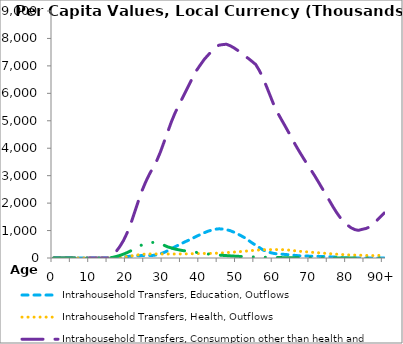
| Category | Intrahousehold Transfers, Education, Outflows | Intrahousehold Transfers, Health, Outflows | Intrahousehold Transfers, Consumption other than health and education, Outflows | Intrahousehold Transfers, Saving, Outflows |
|---|---|---|---|---|
| 0 | 0 | 0 | 0 | 0 |
|  | 0 | 0 | 0 | 0 |
| 2 | 0 | 0 | 0 | 0 |
| 3 | 0 | 0 | 0 | 0 |
| 4 | 0 | 0 | 0 | 0 |
| 5 | 0 | 0 | 0 | 0 |
| 6 | 0 | 0 | 0 | 0 |
| 7 | 0 | 0 | 0 | 0 |
| 8 | 0 | 0 | 0 | 0 |
| 9 | 0 | 0 | 0 | 0 |
| 10 | 0 | 0 | 0 | 0 |
| 11 | 0 | 0 | 0 | 0 |
| 12 | 0 | 0 | 0 | 0 |
| 13 | 0 | 0 | 0 | 0 |
| 14 | 0 | 0 | 0 | 0 |
| 15 | 0 | 0 | 0 | 0 |
| 16 | 5751.779 | 3664.066 | 90783.375 | 22362.815 |
| 17 | 15721.843 | 10719.154 | 239478.714 | 54122.408 |
| 18 | 26796.242 | 19887.261 | 422485.626 | 93887.802 |
| 19 | 39898.469 | 31972.367 | 641475.922 | 141720.232 |
| 20 | 53307.713 | 50377.201 | 922863.543 | 198467.022 |
| 21 | 65915.686 | 71676.03 | 1264449.566 | 264018.356 |
| 22 | 76387.824 | 93282.776 | 1659430.143 | 345818.272 |
| 23 | 84462.599 | 114899.242 | 2066322.743 | 416702.438 |
| 24 | 87700.63 | 132815.177 | 2444062.663 | 476930.473 |
| 25 | 88024.012 | 141977.637 | 2763566.712 | 530974.066 |
| 26 | 90559.66 | 147010.165 | 3043317.891 | 567833.611 |
| 27 | 95369.835 | 149658.138 | 3287810.862 | 566026.323 |
| 28 | 113474.07 | 148495.606 | 3532414.113 | 549698.798 |
| 29 | 148889.954 | 146686.148 | 3848365.635 | 512453.689 |
| 30 | 200869.479 | 146550.044 | 4215943.782 | 465788.579 |
| 31 | 260337.31 | 146612.835 | 4583135.683 | 406545.454 |
| 32 | 334968.296 | 145510.018 | 4952834.11 | 367556.664 |
| 33 | 406999.747 | 145555.724 | 5277595.894 | 325736.119 |
| 34 | 473016.343 | 146498.411 | 5554986.558 | 299927.958 |
| 35 | 539384.999 | 147591.944 | 5822922.779 | 272353.391 |
| 36 | 605287.455 | 150588.378 | 6088617.946 | 257730.01 |
| 37 | 664993.953 | 154583.567 | 6356081.541 | 237605.845 |
| 38 | 731362.327 | 157622.49 | 6623345.521 | 222773.902 |
| 39 | 798024.316 | 161089.445 | 6858486.676 | 201534.596 |
| 40 | 861143.091 | 164423.369 | 7053281.228 | 183188.299 |
| 41 | 920767.536 | 165113.954 | 7239840.499 | 162992.704 |
| 42 | 975821.577 | 166334.302 | 7390362.517 | 144718.904 |
| 43 | 1015018.739 | 169277.599 | 7532075.256 | 130539.081 |
| 44 | 1048737.216 | 173063.272 | 7666680.624 | 117564.872 |
| 45 | 1063179.166 | 178604.994 | 7755136.698 | 106725.239 |
| 46 | 1056072.821 | 186771.914 | 7775368.742 | 96605.611 |
| 47 | 1031865.321 | 196193.249 | 7789660.388 | 87659.472 |
| 48 | 997925.363 | 205409.053 | 7737203.747 | 78094.617 |
| 49 | 943963.88 | 215126.214 | 7663082.941 | 69991.327 |
| 50 | 883830.512 | 224590.789 | 7573681.321 | 62272.442 |
| 51 | 811569.383 | 235408.7 | 7486431.798 | 55525.03 |
| 52 | 738479.462 | 246623.579 | 7365901.763 | 49785.27 |
| 53 | 645204.372 | 259893.362 | 7270596.159 | 45287.57 |
| 54 | 551209.739 | 273281.731 | 7162617.933 | 41535.888 |
| 55 | 463890.204 | 284303.85 | 7051922.899 | 36467.216 |
| 56 | 379719.361 | 294253.285 | 6830602.187 | 31912.763 |
| 57 | 292609.494 | 301077.48 | 6556585.396 | 28533.702 |
| 58 | 237167.729 | 303883.383 | 6230500.233 | 25923.006 |
| 59 | 196027.514 | 304550.069 | 5895519.349 | 21250.844 |
| 60 | 165180.93 | 305800.306 | 5557648.994 | 18111.154 |
| 61 | 148154.897 | 306589.853 | 5286093.47 | 16176.177 |
| 62 | 142390.333 | 304880.454 | 5046164.958 | 14061.299 |
| 63 | 129205.669 | 298227.415 | 4810435.929 | 11008.28 |
| 64 | 117865.077 | 288000.221 | 4569733.326 | 10080.472 |
| 65 | 105381.581 | 274419.495 | 4322030.364 | 10053.837 |
| 66 | 91487.288 | 258821.653 | 4079981.968 | 9920.004 |
| 67 | 78882.775 | 243635.085 | 3854559.674 | 10435.348 |
| 68 | 74612.469 | 231836.029 | 3635914.449 | 11412.136 |
| 69 | 69543.302 | 222155.18 | 3425953.554 | 12492.207 |
| 70 | 66485.699 | 211096.466 | 3221739.088 | 12448.649 |
| 71 | 64282.185 | 199393.858 | 3010852.1 | 12265.379 |
| 72 | 60244.913 | 190148.104 | 2789356.231 | 11351.664 |
| 73 | 55684.866 | 180211.095 | 2563466.116 | 10398.132 |
| 74 | 52194.971 | 169122.936 | 2342992.159 | 0 |
| 75 | 45123.041 | 159184.468 | 2110928.106 | 0 |
| 76 | 37611.98 | 149147.123 | 1880063.572 | 0 |
| 77 | 30190.842 | 137965.686 | 1664618.384 | 0 |
| 78 | 23714.947 | 128450.368 | 1476316.632 | 0 |
| 79 | 0 | 120867.508 | 1332151.086 | 0 |
| 80 | 0 | 112840.866 | 1198270.272 | 0 |
| 81 | 0 | 107174.495 | 1099629.513 | 0 |
| 82 | 0 | 105647.87 | 1034845.623 | 0 |
| 83 | 0 | 104556.262 | 1007942.526 | 0 |
| 84 | 0 | 96932.663 | 1044149.238 | 0 |
| 85 | 0 | 93372.73 | 1074348.281 | 0 |
| 86 | 0 | 90497.504 | 1126852.8 | 0 |
| 87 | 0 | 87867.226 | 1217553.353 | 0 |
| 88 | 0 | 91117.426 | 1367099.123 | 0 |
| 89 | 0 | 98069.543 | 1501717.534 | 0 |
| 90+ | 0 | 104558.301 | 1636796.119 | 0 |